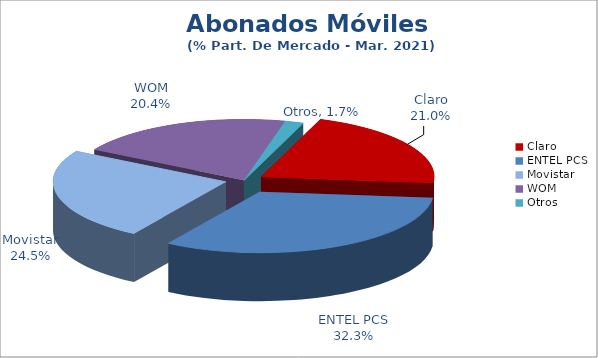
| Category | Series 0 |
|---|---|
| Claro | 0.21 |
| ENTEL PCS | 0.323 |
| Movistar | 0.244 |
| WOM | 0.204 |
| Otros | 0.017 |